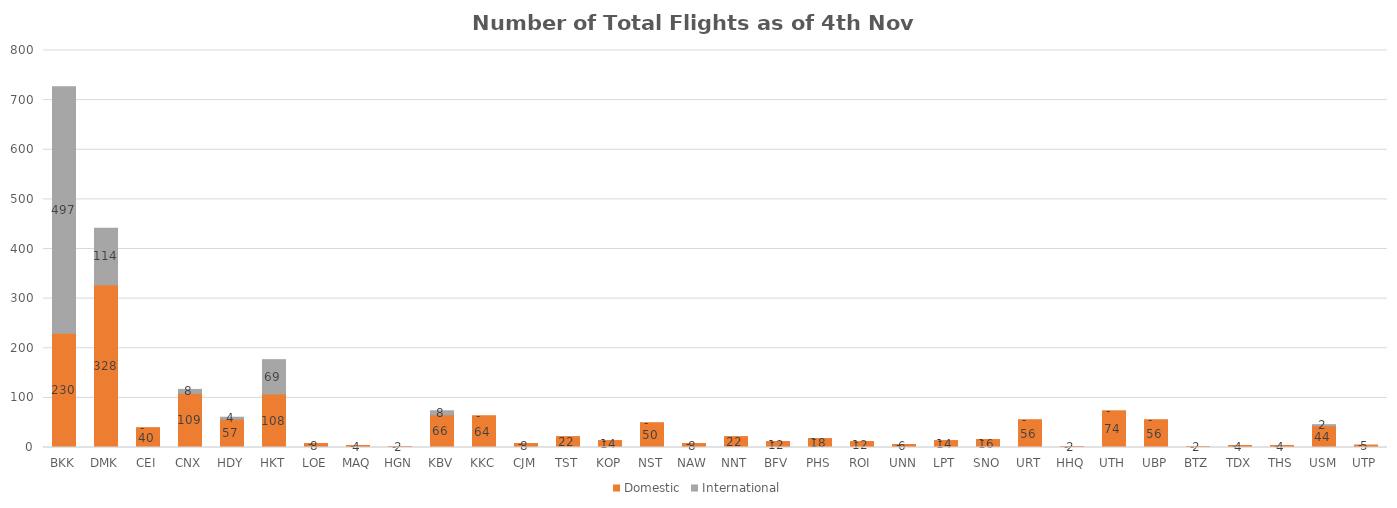
| Category | Domestic | International |
|---|---|---|
| BKK | 230 | 497 |
| DMK | 328 | 114 |
| CEI | 40 | 0 |
| CNX | 109 | 8 |
| HDY | 57 | 4 |
| HKT | 108 | 69 |
| LOE | 8 | 0 |
| MAQ | 4 | 0 |
| HGN | 2 | 0 |
| KBV | 66 | 8 |
| KKC | 64 | 0 |
| CJM | 8 | 0 |
| TST | 22 | 0 |
| KOP | 14 | 0 |
| NST | 50 | 0 |
| NAW | 8 | 0 |
| NNT | 22 | 0 |
| BFV | 12 | 0 |
| PHS | 18 | 0 |
| ROI | 12 | 0 |
| UNN | 6 | 0 |
| LPT | 14 | 0 |
| SNO | 16 | 0 |
| URT | 56 | 0 |
| HHQ | 2 | 0 |
| UTH | 74 | 0 |
| UBP | 56 | 0 |
| BTZ | 2 | 0 |
| TDX | 4 | 0 |
| THS | 4 | 0 |
| USM | 44 | 2 |
| UTP | 5 | 0 |